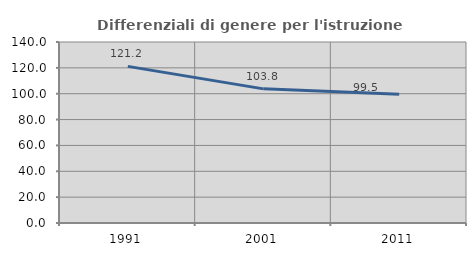
| Category | Differenziali di genere per l'istruzione superiore |
|---|---|
| 1991.0 | 121.157 |
| 2001.0 | 103.758 |
| 2011.0 | 99.519 |